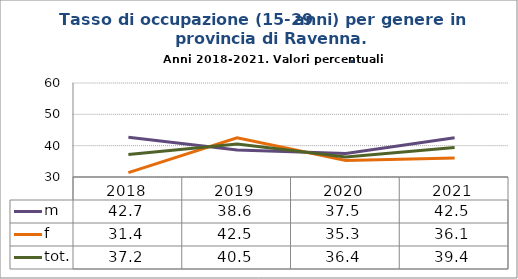
| Category | m | f | tot. |
|---|---|---|---|
| 2018.0 | 42.7 | 31.4 | 37.2 |
| 2019.0 | 38.6 | 42.5 | 40.5 |
| 2020.0 | 37.5 | 35.3 | 36.4 |
| 2021.0 | 42.5 | 36.1 | 39.4 |